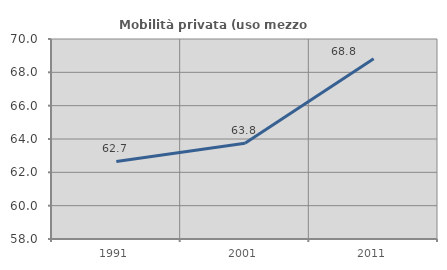
| Category | Mobilità privata (uso mezzo privato) |
|---|---|
| 1991.0 | 62.651 |
| 2001.0 | 63.75 |
| 2011.0 | 68.817 |